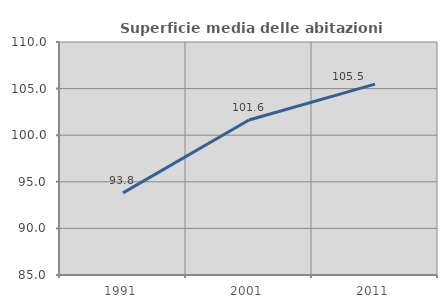
| Category | Superficie media delle abitazioni occupate |
|---|---|
| 1991.0 | 93.812 |
| 2001.0 | 101.631 |
| 2011.0 | 105.486 |